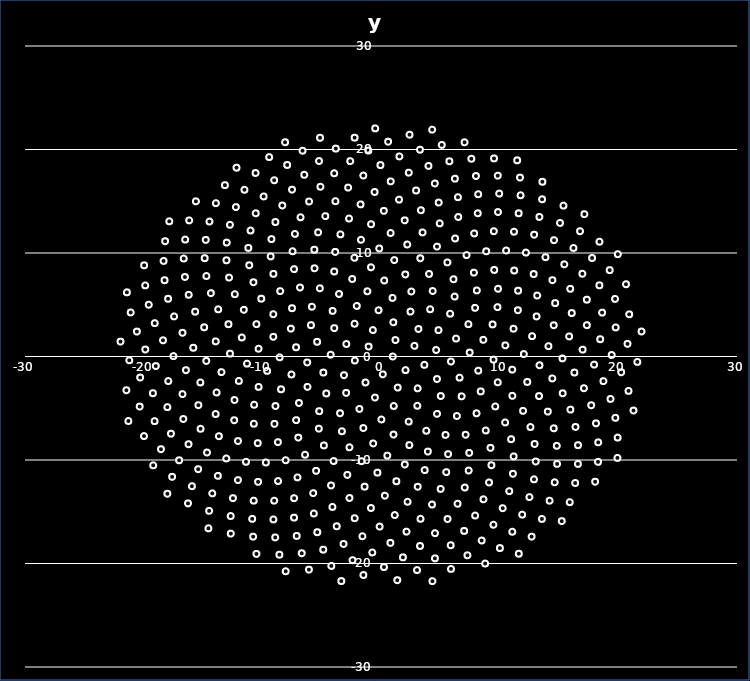
| Category | y |
|---|---|
| 1.0 | 0 |
| -1.0427970936428017 | 0.955 |
| 0.1514258902703649 | -1.725 |
| 1.2168775933951685 | 1.587 |
| -2.201886249462149 | -0.389 |
| 2.0667701175467137 | -1.315 |
| -0.6868488439654367 | 2.555 |
| -1.3036414562824385 | -2.51 |
| 2.8179636666845864 | 1.029 |
| -2.9230375956493755 | 1.207 |
| 1.4057389455386489 | -3.004 |
| 1.0367487365334913 | 3.305 |
| -3.1195627951311913 | -1.808 |
| 3.6543864048728047 | -0.803 |
| -2.22746789859802 | 3.168 |
| -0.5140411526383476 | -3.967 |
| 3.152727426917154 | 2.657 |
| -4.239017781566231 | 0.175 |
| 3.089717279442825 | -3.075 |
| -0.20657671794645202 | 4.467 |
| -2.936096255307038 | -3.518 |
| 4.64852723793221 | 0.625 |
| -3.9366999155815305 | 2.739 |
| 1.0752376934697032 | -4.78 |
| 2.48590156366684 | 4.338 |
| -4.857798015295011 | -1.55 |
| 4.7170226280028915 | -2.179 |
| -2.042846787210307 | 4.881 |
| -1.8226174734269953 | -5.067 |
| 4.848380230100924 | 2.548 |
| -5.383862284478178 | 1.419 |
| 3.059444241048141 | -4.758 |
| 0.9729871422187473 | 5.662 |
| -4.610082518912712 | -3.57 |
| 5.895880809300576 | -0.488 |
| -4.074480240837586 | 4.404 |
| 0.029679313881297995 | -6.083 |
| 4.1417737703254085 | 4.566 |
| -6.21834813116179 | -0.576 |
| 5.03788828144644 | -3.824 |
| -1.1460609228401943 | 6.3 |
| -3.451672677211961 | -5.485 |
| 6.324235433015204 | 1.733 |
| -5.901514804705317 | 3.029 |
| 2.331891982730801 | -6.29 |
| 2.5572200687000044 | 6.282 |
| -6.195148787465504 | -2.936 |
| 6.620681976627493 | -2.041 |
| -3.5393643128245627 | 6.039 |
| -1.484578362719784 | -6.913 |
| 5.822022914882723 | 4.136 |
| -7.1557458339192985 | 0.892 |
| 4.718752856929229 | -5.544 |
| 0.2677913955382807 | 7.344 |
| -5.205523482141479 | -5.282 |
| 7.473551358802312 | 0.382 |
| -5.820175460384126 | 4.809 |
| 1.0523599916907702 | -7.543 |
| 4.356126693917473 | 6.326 |
| -7.548708171978155 | -1.737 |
| 6.795407549658492 | -3.85 |
| -2.4297647347738476 | 7.49 |
| -3.293861630890022 | -7.222 |
| 7.364626127054 | 3.124 |
| -7.5996776580306955 | 2.692 |
| 3.814601393719907 | -7.173 |
| 2.0477156584077725 | 7.925 |
| -6.914263388139157 | -4.494 |
| 8.193373972120753 | -1.367 |
| -5.155114941727751 | 6.59 |
| -0.6547168776294818 | -8.401 |
| 6.200552287266446 | 5.793 |
| -8.54359692988896 | -0.083 |
| 6.39948894780885 | -5.749 |
| -0.8412798835335981 | 8.619 |
| -5.236481006769523 | -6.97 |
| 8.625499060132771 | 1.613 |
| -7.497748018424347 | 4.667 |
| 2.3910657700193485 | -8.561 |
| 4.0448220188972694 | 7.977 |
| -8.423360939036675 | -3.17 |
| 8.40362386503289 | -3.373 |
| -3.941761722648997 | 8.214 |
| -2.6575110926599104 | -8.771 |
| 7.931361323333284 | 4.7 |
| -9.076319074692739 | 1.903 |
| 5.438657778798727 | -7.578 |
| 1.1146932706645942 | 9.314 |
| -7.154010023229385 | -6.15 |
| 9.482105598167498 | -0.299 |
| -6.827146071129699 | 6.663 |
| 0.5365358084039645 | -9.577 |
| 6.106223624352265 | 7.464 |
| -9.59570006387784 | -1.387 |
| 8.054681740007293 | -5.488 |
| -2.24365386614781 | 9.538 |
| -4.813036414151504 | -8.593 |
| 9.401365126140643 | 3.101 |
| -9.072704226184475 | 4.085 |
| 3.9504521611844208 | -9.187 |
| 3.308951430444219 | 9.49 |
| -8.893694940298154 | -4.786 |
| 9.838451976726452 | -2.491 |
| -5.5989347758745085 | 8.524 |
| -1.6369490219107636 | -10.115 |
| 8.078053240485318 | 6.383 |
| -10.316606466458834 | 0.753 |
| 7.131313750881705 | -7.559 |
| -0.15281771884104275 | 10.439 |
| -6.970644039958124 | -7.836 |
| 10.480706522932923 | 1.075 |
| -8.492032765497799 | 6.315 |
| 2.0046002197953747 | -10.439 |
| 5.598207299772104 | 9.092 |
| -10.314281085926556 | -2.935 |
| 9.629750279197825 | -4.824 |
| -3.85885416894729 | 10.105 |
| -3.9973446110499413 | -10.101 |
| 9.81165750540846 | 4.768 |
| -10.499213597845515 | 3.125 |
| 5.654203325426085 | -9.436 |
| 2.2134925857403336 | 10.821 |
| -8.978412995663625 | -6.511 |
| 11.062958203458424 | -1.269 |
| -7.329502716213936 | 8.443 |
| -0.2995738261482835 | -11.221 |
| 7.831448576231053 | 8.104 |
| -11.292771809740017 | -0.688 |
| 8.82593237153248 | -7.149 |
| -1.6856333671399464 | 11.276 |
| -6.398677358932378 | -9.49 |
| 11.17086982231301 | 2.685 |
| -10.089050869219788 | 5.587 |
| 3.6793553709753057 | -10.976 |
| 4.718331971574417 | 10.618 |
| -10.6907379679323 | -4.659 |
| 11.070738435044447 | -3.8 |
| -5.6168541193205925 | 10.318 |
| -2.8379088137951447 | -11.443 |
| 9.857608522818861 | 6.544 |
| -11.730962185986698 | 1.84 |
| 7.433562416373874 | -9.314 |
| 0.81277928778123 | 11.931 |
| -8.688548474076466 | -8.277 |
| 12.039301232496229 | 0.235 |
| -9.067253265932298 | 7.987 |
| 1.2954902829092911 | -12.055 |
| 7.212150703992325 | 9.797 |
| -11.976176623015526 | -2.36 |
| 10.460170760927817 | -6.371 |
| -3.4210580324872777 | 11.802 |
| -5.467832477815905 | -11.05 |
| 11.533740296929068 | 4.469 |
| -11.561050434784706 | 4.51 |
| 5.495904539403401 | -11.171 |
| 3.504758706871615 | 11.988 |
| -10.716388022946688 | -6.493 |
| 12.32695974061193 | -2.459 |
| -7.452041979738917 | 10.172 |
| -1.3804202125928589 | -12.574 |
| 9.540873395018599 | 8.365 |
| -12.724894425843498 | 0.278 |
| 9.223762426207262 | -8.827 |
| -0.8410908935483941 | 12.779 |
| -8.036012948426716 | -10.021 |
| 12.733073861797 | 1.967 |
| -10.749851031410303 | 7.172 |
| 3.091055976039551 | -12.588 |
| 6.241985923194259 | 11.403 |
| -12.341887649177131 | -4.204 |
| 11.975690031308076 | -5.252 |
| -5.298293055390513 | 11.997 |
| -4.209245699952344 | -12.461 |
| 11.554456764707028 | 6.364 |
| -12.85518215626661 | 3.122 |
| 7.391439618777495 | -11.017 |
| 1.9970730195609516 | 13.153 |
| -10.386784795867298 | -8.373 |
| 13.352427078896897 | -0.844 |
| -9.301281419735853 | 9.669 |
| 0.3281866631991413 | -13.45 |
| 8.86748803842526 | 10.167 |
| -13.443091817320633 | -1.511 |
| 10.963051142124453 | -7.988 |
| -2.6951483610571403 | 13.332 |
| -7.037106978853936 | -11.682 |
| 13.115425331629215 | 3.871 |
| -12.318620800296184 | 6.021 |
| 5.029612591372445 | -12.795 |
| 4.947015504105854 | 12.866 |
| -12.370878613912275 | -6.161 |
| 13.318514248501673 | -3.823 |
| -7.256920195988216 | 11.846 |
| -2.6579576213687663 | -13.672 |
| 11.22430403241927 | 8.308 |
| -13.923671120869864 | 1.46 |
| 9.304361694388612 | -10.509 |
| 0.23825408596760478 | 14.069 |
| -9.70372115358941 | -10.239 |
| 14.106900780991756 | 0.998 |
| -11.10356315289638 | 8.815 |
| 2.238267295087915 | -14.035 |
| 7.849650300993459 | 11.89 |
| -13.853974212630401 | -3.474 |
| 12.592770308257572 | -6.813 |
| -4.694554177575003 | 13.563 |
| -5.714029264364662 | -13.204 |
| 13.164312945627831 | 5.891 |
| -13.71895499612133 | 4.56 |
| 7.052753732548915 | -12.659 |
| 3.3587423836123786 | 14.132 |
| -12.051246737248842 | -8.171 |
| 14.439672753986759 | -2.12 |
| -9.236701421853198 | 11.344 |
| -0.8538042479745327 | -14.638 |
| 10.541825421852963 | 10.241 |
| -14.724607662090515 | -0.431 |
| 11.174394588203622 | -9.651 |
| -1.724747963085524 | 14.698 |
| -8.676184665513935 | -12.03 |
| 14.556749844128758 | 3.017 |
| -12.800370425018265 | 7.626 |
| 4.297189308986362 | -14.302 |
| 6.506479857119222 | 13.478 |
| -13.933162289927612 | -5.556 |
| 14.057909974709128 | -5.327 |
| -6.782596708990005 | 13.453 |
| -4.095416564141486 | -14.534 |
| 12.865306437839108 | 7.968 |
| -14.90099445636362 | 2.821 |
| 9.101415044634841 | -12.172 |
| 1.5144194154709818 | 15.156 |
| -11.378909866474586 | -10.174 |
| 15.29594731949717 | -0.184 |
| -11.178017973997123 | 10.491 |
| 1.1585064978907877 | -15.319 |
| 9.513374053615959 | 12.104 |
| -15.22270475442516 | -2.504 |
| 12.943180838835888 | -8.454 |
| -3.8411569995307002 | 15.008 |
| -7.320734998532481 | -13.69 |
| 14.675668682001298 | 5.16 |
| -14.336384860309096 | 6.121 |
| 6.44967963717112 | -14.227 |
| 4.864204094464983 | 14.877 |
| -13.664109150370217 | -7.7 |
| 15.307876265431732 | -3.559 |
| -8.90121421427017 | 12.991 |
| -2.2163305066573815 | -15.623 |
| 12.212097182993336 | 10.043 |
| -15.820410947664326 | 0.845 |
| 11.116539468640187 | -11.332 |
| -0.5431609975437187 | 15.897 |
| -10.357964006866741 | -12.112 |
| 15.85062454139551 | 1.938 |
| -13.022641110691772 | 9.296 |
| 3.329791727183006 | -15.682 |
| 8.153297770044812 | 13.839 |
| -15.389979105612404 | -4.706 |
| 14.55511793892687 | -6.939 |
| -6.056936095018434 | 14.977 |
| -5.66150384696126 | -15.164 |
| 14.445250622460836 | 7.371 |
| -15.660346951511519 | 4.331 |
| 8.63853299897801 | -13.798 |
| 2.9559691441457248 | 16.039 |
| -13.03853581975934 | -9.849 |
| 16.297335161603055 | -1.548 |
| -10.991816256335783 | 12.173 |
| -0.11788399042460239 | -16.431 |
| 11.206771975581029 | 12.059 |
| -16.439195008018405 | -1.324 |
| 13.039977174349056 | -10.147 |
| -2.766213210006769 | 16.32 |
| -9.000778879410824 | -13.928 |
| 16.07419156049911 | 4.198 |
| -14.71467349638158 | 7.777 |
| 5.607093753997097 | -15.702 |
| 6.483847513475072 | 15.393 |
| -15.2063228081222 | -6.983 |
| 15.958302878340803 | -5.132 |
| -8.31561670195076 | 14.589 |
| -3.7299147848234764 | -16.404 |
| 13.855408788092536 | 9.593 |
| -16.72596562793675 | 2.29 |
| 10.805540298240846 | -13.009 |
| 0.8213773041149172 | 16.921 |
| -12.056680710078918 | -11.943 |
| 16.987050494278172 | 0.663 |
| -12.996277765824464 | 11.004 |
| 2.153390677390724 | -16.922 |
| 9.859877074446171 | 13.956 |
| -16.726388561755357 | -3.637 |
| 14.815509257285854 | -8.631 |
| -5.102739898336628 | 16.4 |
| -7.32786956863964 | -15.566 |
| 15.944933441166112 | 6.539 |
| -16.201565334941503 | 5.959 |
| 7.93458614461198 | -15.364 |
| 4.5348567495029855 | 16.716 |
| -14.659940560764174 | -9.278 |
| 17.10550367980478 | -3.066 |
| -10.55929929636039 | 13.838 |
| -1.5641776886222598 | -17.365 |
| 12.904633987864646 | 11.767 |
| -17.492809617535233 | 0.04 |
| 12.89255039471053 | -11.865 |
| -1.4941895892909123 | 17.486 |
| -10.727365368850057 | -13.926 |
| 17.34466223973096 | 3.027 |
| -14.858026096183028 | 9.499 |
| 4.546369326612573 | -17.068 |
| 8.190285751749686 | 15.682 |
| -16.658721056288314 | -6.04 |
| 16.389923107986647 | -6.81 |
| -7.497484939215911 | 16.118 |
| -5.367566735632506 | -16.976 |
| 15.449402838348117 | 8.906 |
| -17.435141234387686 | 3.875 |
| 10.254621797138068 | -14.658 |
| 2.343222070930613 | 17.763 |
| -13.747634147638433 | -11.533 |
| 17.955102347475673 | -0.784 |
| -12.729763022459315 | 12.726 |
| 0.7914059619391862 | -18.01 |
| 11.600081503326097 | 13.836 |
| -17.9271336733174 | -2.37 |
| 14.84260531962871 | -10.378 |
| -3.9404197754803967 | 17.705 |
| -9.067877694424709 | -15.741 |
| 17.345366926896872 | 5.49 |
| -16.52316467446578 | 7.68 |
| 7.006314673380863 | -16.85 |
| 6.224878879181062 | 17.183 |
| -16.22111963799109 | -8.478 |
| 17.714087465193007 | -4.713 |
| -9.893010986118647 | 15.464 |
| -3.1555023066133256 | -18.112 |
| 14.582741030361053 | 11.24 |
| -18.372590967665037 | 1.565 |
| 12.508875515266 | -13.584 |
| -0.04779174141991187 | 18.493 |
| -12.474921551161257 | -13.689 |
| 18.47196816456592 | 1.669 |
| -14.76963702834024 | 11.263 |
| 3.287298305993513 | -18.308 |
| 9.957482072203504 | 15.743 |
| -18.00260486106448 | -4.889 |
| 16.60110292429176 | -8.568 |
| -6.463061313438255 | 17.556 |
| -7.103675364950847 | -17.336 |
| 16.972471971834114 | 7.996 |
| -17.94158952754723 | 5.577 |
| 9.475970241921393 | -16.254 |
| 3.9980481586810974 | 18.412 |
| -15.407072021813871 | -10.891 |
| 18.74398662362531 | -2.38 |
| -12.230863622651016 | 14.436 |
| -0.7339264212246063 | -18.933 |
| 13.348835895319667 | 13.484 |
| -18.977387588591835 | -0.927 |
| 14.639541939802665 | -12.153 |
| -2.589401011733699 | 18.876 |
| -10.855983144884899 | -15.689 |
| 18.628229471449515 | 4.241 |
| -16.62359439130852 | 9.469 |
| 5.869715100477349 | -18.236 |
| 8.000876188794189 | 17.435 |
| -17.700902271722644 | -7.462 |
| 18.116948902245344 | -6.463 |
| -9.00502256523035 | 17.027 |
| -4.867914944805683 | -18.663 |
| 16.217802960324235 | 10.487 |
| -19.06806261432071 | 3.226 |
| 11.896737383898543 | -15.28 |
| 1.5510333477124014 | 19.329 |
| -14.218827017707847 | -13.222 |
| 19.441680586938325 | 0.145 |
| -14.452788320898156 | 13.043 |
| 1.8491277014868328 | -19.406 |
| 11.760307873723223 | 15.579 |
| -19.220103329066642 | -3.548 |
| 16.590554365918702 | -10.38 |
| -5.228285535708314 | 18.886 |
| -8.913432076195724 | -17.48 |
| 18.40391865052876 | 6.877 |
| -18.239534444264773 | 7.37 |
| 8.481725371694601 | -17.778 |
| 5.7621747387420115 | 18.863 |
| -17.012169724670375 | -10.029 |
| 19.34366522943572 | -4.102 |
| -11.507555303534465 | 16.111 |
| -2.4008152894415122 | -19.678 |
| 15.081948687764658 | 12.905 |
| -19.863211134052122 | 0.673 |
| 14.209905195567787 | -13.931 |
| -1.0688927370492847 | 19.896 |
| -12.667423023579804 | -15.412 |
| 19.776163277684127 | 2.811 |
| -16.50196886025767 | 11.3 |
| 4.5408125974752735 | -19.503 |
| 9.838319834089088 | 17.47 |
| -19.079099049938318 | -6.244 |
| 18.30879290492278 | -8.294 |
| -7.907681715680329 | 18.506 |
| -6.677910317065903 | -19.011 |
| 17.78747035549893 | 9.519 |
| -19.569722698377547 | 5.003 |
| 11.064435258503478 | -16.929 |
| 3.280552811222075 | 19.981 |
| -15.935306240328657 | -12.533 |
| 20.240425847703502 | -1.525 |
| -13.911492664680196 | 14.815 |
| 0.2511328842427642 | -20.345 |
| 13.574333810644436 | 15.19 |
| -20.294426097830264 | -2.034 |
| 16.357904123804875 | -12.224 |
| -3.8093750212462365 | 20.087 |
| -10.77253960122139 | -17.406 |
| 19.724095299786384 | 5.564 |
| -18.324257479358682 | 9.232 |
| 7.284548722446106 | -19.208 |
| 7.6122112540961275 | 19.106 |
| -18.541067592684325 | -8.957 |
| 19.745252656218103 | -5.927 |
| -10.568562839251687 | 17.729 |
| -4.1875159725890185 | -20.235 |
| 16.776057705898154 | 12.106 |
| -20.571860306503904 | 2.408 |
| 13.558229949064003 | -15.69 |
| 0.6016871888348588 | 20.752 |
| -14.47808376415756 | -14.913 |
| 20.772993650586034 | 1.218 |
| -16.158514218795638 | 13.149 |
| 3.036096257320039 | -20.634 |
| 11.71311359546382 | 17.286 |
| -20.336637098687923 | -4.84 |
| 18.28555478153726 | -10.18 |
| -6.6140438039813745 | 19.881 |
| -8.562171717046688 | -19.149 |
| 19.270391733140624 | 8.346 |
| -19.869368420613007 | 6.871 |
| 10.021197644535814 | -18.509 |
| 5.118961334786726 | 20.44 |
| -17.601415609605922 | -11.627 |
| 20.856144563443966 | -3.32 |
| -13.150881608159017 | 16.555 |
| -1.4870712909613508 | -21.114 |
| 15.3757555480822 | 14.58 |
| -21.210057591282485 | -0.365 |
| 15.904047032282968 | -14.073 |
| -2.223148567326424 | 21.144 |
| -12.657086051644594 | -17.111 |
| 20.914535916311888 | 4.072 |
| -18.192410543693573 | 11.137 |
| 5.897949090337883 | -20.524 |
| 9.524889620401188 | 19.138 |
| -19.972943730756374 | -7.686 |
| 19.941284295718052 | -7.832 |
| -9.423677920258577 | 19.266 |
| -6.072130434582072 | -20.594 |
| 18.40864929426374 | 11.096 |
| -21.092007992467963 | 4.258 |
| 12.690302273777442 | -17.406 |
| 2.4024896027239895 | 21.43 |
| -16.264472545070774 | -14.194 |
| 21.603903715643803 | -0.521 |
| -15.594849007353607 | 14.993 |
| 1.3727556103368534 | -21.613 |
| 13.601524112862984 | 16.882 |
| -21.45568881195591 | -3.264 |
| 18.044654262188402 | -12.099 |
| -5.1381144048606435 | 21.133 |
| -10.497466876310574 | -19.074 |
| 20.646298473363295 | 6.981 |
| -19.960320063495978 | 8.808 |
| 8.777423839058509 | -19.999 |
| 7.044249448056655 | 20.697 |
| -19.195087652062732 | -10.514 |
| 21.278283568310037 | -5.219 |
| -12.177440156957651 | 18.24 |
| -3.345377808592461 | -21.698 |
| 17.14140104695307 | 13.754 |
| -21.952915981680526 | 1.439 |
| 15.231368807751767 | -15.906 |
| -0.4871937887914052 | 22.04 |
| -14.543519489352208 | -16.598 |
| 21.95808216069666 | 2.417 |
| -17.8422229575029 | 13.064 |
| 4.336459036288925 | -21.707 |
| 11.477010535090924 | 18.955 |
| -21.288108182185947 | -6.23 |
| 19.92590478282118 | -9.796 |
| -8.083939649116735 | 20.704 |
| -8.032529828231308 | -20.748 |
| 19.958122171509682 | 9.883 |
| -21.413911653462453 | 6.2 |
| 11.61333952636508 | -19.056 |
| 4.313137248420406 | 21.918 |
| -18.003752927149716 | -13.261 |